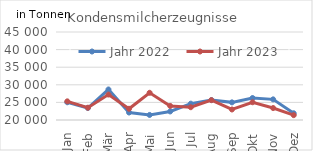
| Category | Jahr 2022 | Jahr 2023 |
|---|---|---|
| Jan | 25042.305 | 25298.204 |
| Feb | 23409.267 | 23488.544 |
| Mär | 28674.942 | 27229.124 |
| Apr | 22126.142 | 23189.306 |
| Mai | 21437.528 | 27728.51 |
| Jun | 22431.951 | 23996.484 |
| Jul | 24641.026 | 23632.424 |
| Aug | 25672.078 | 25632.733 |
| Sep | 25010.486 | 22988.882 |
| Okt | 26246.844 | 25040.382 |
| Nov | 25862.894 | 23399.072 |
| Dez | 21907.746 | 21377.843 |